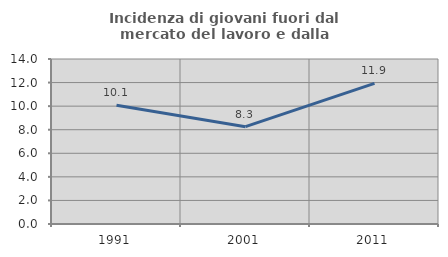
| Category | Incidenza di giovani fuori dal mercato del lavoro e dalla formazione  |
|---|---|
| 1991.0 | 10.067 |
| 2001.0 | 8.259 |
| 2011.0 | 11.93 |